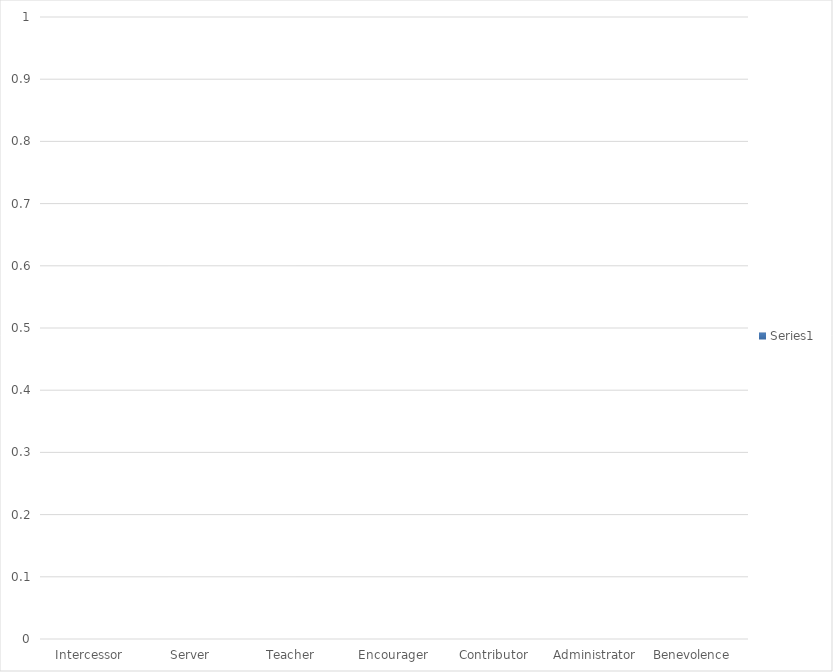
| Category | Series 0 |
|---|---|
| Intercessor | 0 |
| Server | 0 |
| Teacher | 0 |
| Encourager | 0 |
| Contributor | 0 |
| Administrator | 0 |
| Benevolence   | 0 |